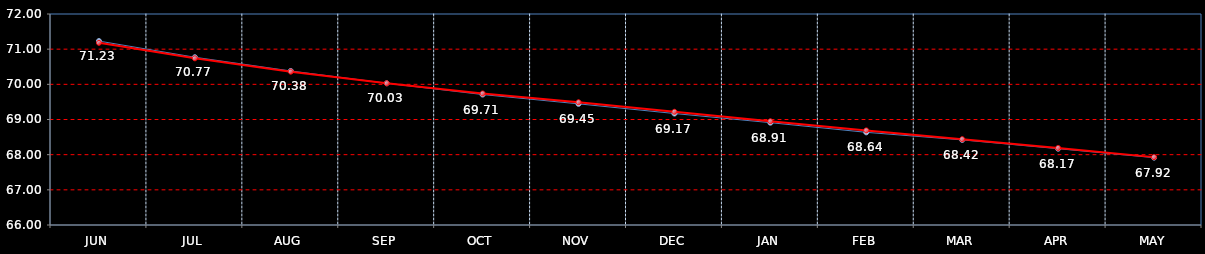
| Category | Last | Settlement |
|---|---|---|
| JUN | 71.23 | 71.18 |
| JUL | 70.77 | 70.74 |
| AUG | 70.38 | 70.36 |
| SEP | 70.03 | 70.03 |
| OCT | 69.71 | 69.74 |
| NOV | 69.445 | 69.49 |
| DEC | 69.17 | 69.22 |
| JAN | 68.91 | 68.95 |
| FEB | 68.635 | 68.69 |
| MAR | 68.42 | 68.44 |
| APR | 68.17 | 68.19 |
| MAY | 67.915 | 67.93 |